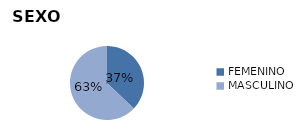
| Category | Series 0 |
|---|---|
| FEMENINO | 1028 |
| MASCULINO | 1745 |